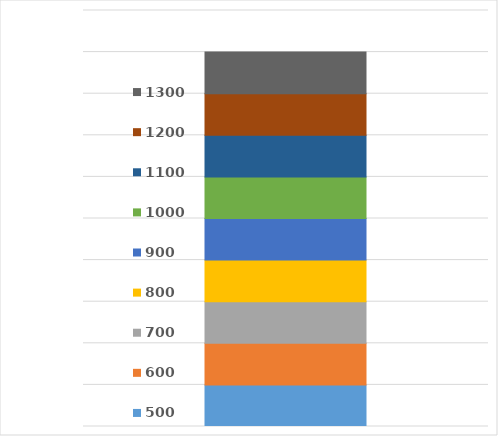
| Category | 500 | 600 | 700 | 800 | 900 | 1000 | 1100 | 1200 | 1300 |
|---|---|---|---|---|---|---|---|---|---|
| 0 | 100 | 100 | 100 | 100 | 100 | 100 | 100 | 100 | 100 |